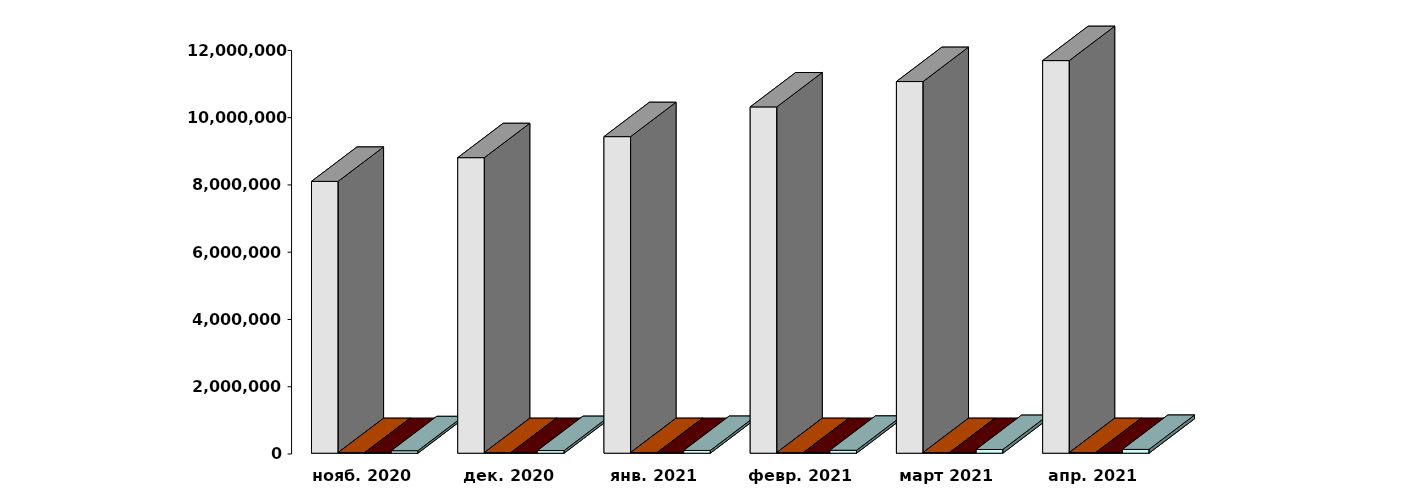
| Category | Физические лица | Юридические лица | Иностранные лица | Клиенты, передавшие свои средства в ДУ |
|---|---|---|---|---|
| 2020-11-28 | 8083085 | 18780 | 17081 | 73469 |
| 2020-12-28 | 8787077 | 19014 | 17268 | 79270 |
| 2021-01-28 | 9412672 | 19074 | 17041 | 82193 |
| 2021-02-28 | 10296032 | 19173 | 17445 | 86734 |
| 2021-03-30 | 11050505 | 19312 | 17990 | 110250 |
| 2021-04-30 | 11673527 | 19474 | 18437 | 113270 |